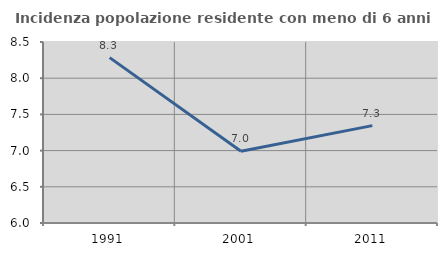
| Category | Incidenza popolazione residente con meno di 6 anni |
|---|---|
| 1991.0 | 8.284 |
| 2001.0 | 6.991 |
| 2011.0 | 7.345 |